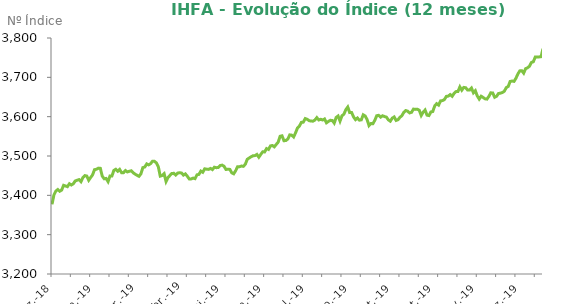
| Category | Número Índice |
|---|---|
| 2018-12-31 | 3377.15 |
| 2019-01-02 | 3401.11 |
| 2019-01-03 | 3410.88 |
| 2019-01-04 | 3414.74 |
| 2019-01-07 | 3410.36 |
| 2019-01-08 | 3413.41 |
| 2019-01-09 | 3425.43 |
| 2019-01-10 | 3423.91 |
| 2019-01-11 | 3422.05 |
| 2019-01-14 | 3429.47 |
| 2019-01-15 | 3426.26 |
| 2019-01-16 | 3429.22 |
| 2019-01-17 | 3436.47 |
| 2019-01-18 | 3438.33 |
| 2019-01-21 | 3439.97 |
| 2019-01-22 | 3434.78 |
| 2019-01-23 | 3445.3 |
| 2019-01-24 | 3450.2 |
| 2019-01-25 | 3449.02 |
| 2019-01-28 | 3438.36 |
| 2019-01-29 | 3445.38 |
| 2019-01-30 | 3452.17 |
| 2019-01-31 | 3465.34 |
| 2019-02-01 | 3466.31 |
| 2019-02-04 | 3469.1 |
| 2019-02-05 | 3468.62 |
| 2019-02-06 | 3448.82 |
| 2019-02-07 | 3442.1 |
| 2019-02-08 | 3442.92 |
| 2019-02-11 | 3434.87 |
| 2019-02-12 | 3449.41 |
| 2019-02-13 | 3449.28 |
| 2019-02-14 | 3463.32 |
| 2019-02-15 | 3466.29 |
| 2019-02-18 | 3461.34 |
| 2019-02-19 | 3465.91 |
| 2019-02-20 | 3457.52 |
| 2019-02-21 | 3457.68 |
| 2019-02-22 | 3463.13 |
| 2019-02-25 | 3459.46 |
| 2019-02-26 | 3461.08 |
| 2019-02-27 | 3462.43 |
| 2019-02-28 | 3457.39 |
| 2019-03-01 | 3453.9 |
| 2019-03-06 | 3450.98 |
| 2019-03-07 | 3448.38 |
| 2019-03-08 | 3454.71 |
| 2019-03-11 | 3470.55 |
| 2019-03-12 | 3472 |
| 2019-03-13 | 3479.8 |
| 2019-03-14 | 3477.46 |
| 2019-03-15 | 3480.44 |
| 2019-03-18 | 3486.81 |
| 2019-03-19 | 3486.47 |
| 2019-03-20 | 3482.55 |
| 2019-03-21 | 3472.66 |
| 2019-03-22 | 3448.91 |
| 2019-03-25 | 3450.49 |
| 2019-03-26 | 3455.04 |
| 2019-03-27 | 3435.26 |
| 2019-03-28 | 3445.23 |
| 2019-03-29 | 3450.55 |
| 2019-04-01 | 3455.53 |
| 2019-04-02 | 3455.96 |
| 2019-04-03 | 3451.66 |
| 2019-04-04 | 3456.6 |
| 2019-04-05 | 3457.46 |
| 2019-04-08 | 3456.75 |
| 2019-04-09 | 3451.45 |
| 2019-04-10 | 3454.53 |
| 2019-04-11 | 3448.57 |
| 2019-04-12 | 3441.68 |
| 2019-04-15 | 3441.78 |
| 2019-04-16 | 3443.8 |
| 2019-04-17 | 3442.35 |
| 2019-04-18 | 3452.15 |
| 2019-04-22 | 3453.19 |
| 2019-04-23 | 3461.68 |
| 2019-04-24 | 3458.64 |
| 2019-04-25 | 3467.48 |
| 2019-04-26 | 3466.45 |
| 2019-04-29 | 3465.96 |
| 2019-04-30 | 3468.43 |
| 2019-05-02 | 3465.48 |
| 2019-05-03 | 3471.48 |
| 2019-05-06 | 3470.29 |
| 2019-05-07 | 3470.76 |
| 2019-05-08 | 3475.74 |
| 2019-05-09 | 3476.77 |
| 2019-05-10 | 3473.98 |
| 2019-05-13 | 3465.77 |
| 2019-05-14 | 3466.3 |
| 2019-05-15 | 3465.94 |
| 2019-05-16 | 3457.25 |
| 2019-05-17 | 3454.72 |
| 2019-05-20 | 3462.51 |
| 2019-05-21 | 3472.72 |
| 2019-05-22 | 3472.85 |
| 2019-05-23 | 3474.52 |
| 2019-05-24 | 3473.72 |
| 2019-05-27 | 3478.96 |
| 2019-05-28 | 3491.5 |
| 2019-05-29 | 3494.91 |
| 2019-05-30 | 3498.04 |
| 2019-05-31 | 3500.7 |
| 2019-06-03 | 3501.03 |
| 2019-06-04 | 3503.99 |
| 2019-06-05 | 3496.92 |
| 2019-06-06 | 3504.11 |
| 2019-06-07 | 3510.63 |
| 2019-06-10 | 3510.43 |
| 2019-06-11 | 3518.93 |
| 2019-06-12 | 3516.54 |
| 2019-06-13 | 3525.65 |
| 2019-06-14 | 3526.71 |
| 2019-06-17 | 3523.26 |
| 2019-06-18 | 3529.37 |
| 2019-06-19 | 3535.22 |
| 2019-06-21 | 3550.18 |
| 2019-06-24 | 3551.32 |
| 2019-06-25 | 3538.83 |
| 2019-06-26 | 3539.32 |
| 2019-06-27 | 3543.3 |
| 2019-06-28 | 3553.65 |
| 2019-07-01 | 3553.04 |
| 2019-07-02 | 3548.42 |
| 2019-07-03 | 3558.97 |
| 2019-07-04 | 3571.32 |
| 2019-07-05 | 3576.12 |
| 2019-07-08 | 3585.51 |
| 2019-07-09 | 3586.05 |
| 2019-07-10 | 3595.15 |
| 2019-07-11 | 3593.46 |
| 2019-07-12 | 3589.89 |
| 2019-07-15 | 3588.83 |
| 2019-07-16 | 3588.57 |
| 2019-07-17 | 3591.38 |
| 2019-07-18 | 3597.59 |
| 2019-07-19 | 3591.67 |
| 2019-07-22 | 3593.35 |
| 2019-07-23 | 3591.51 |
| 2019-07-24 | 3594.15 |
| 2019-07-25 | 3584.45 |
| 2019-07-26 | 3587.89 |
| 2019-07-29 | 3590.73 |
| 2019-07-30 | 3590.33 |
| 2019-07-31 | 3583.69 |
| 2019-08-01 | 3598.05 |
| 2019-08-02 | 3601.69 |
| 2019-08-05 | 3588.68 |
| 2019-08-06 | 3602.24 |
| 2019-08-07 | 3606.34 |
| 2019-08-08 | 3617.72 |
| 2019-08-09 | 3624.53 |
| 2019-08-12 | 3610.34 |
| 2019-08-13 | 3610.55 |
| 2019-08-14 | 3599.38 |
| 2019-08-15 | 3592.43 |
| 2019-08-16 | 3596.68 |
| 2019-08-19 | 3591.12 |
| 2019-08-20 | 3591.86 |
| 2019-08-21 | 3604.7 |
| 2019-08-22 | 3601.78 |
| 2019-08-23 | 3592.65 |
| 2019-08-26 | 3577.37 |
| 2019-08-27 | 3582.55 |
| 2019-08-28 | 3582.03 |
| 2019-08-29 | 3590.8 |
| 2019-08-30 | 3602.48 |
| 2019-09-02 | 3603.44 |
| 2019-09-03 | 3598.71 |
| 2019-09-04 | 3602.27 |
| 2019-09-05 | 3600.4 |
| 2019-09-06 | 3598.84 |
| 2019-09-09 | 3591.95 |
| 2019-09-10 | 3588.45 |
| 2019-09-11 | 3596.16 |
| 2019-09-12 | 3599.3 |
| 2019-09-13 | 3590.4 |
| 2019-09-16 | 3592.25 |
| 2019-09-17 | 3598.49 |
| 2019-09-18 | 3602.45 |
| 2019-09-19 | 3611.08 |
| 2019-09-20 | 3615.5 |
| 2019-09-23 | 3613.9 |
| 2019-09-24 | 3609.54 |
| 2019-09-25 | 3611.04 |
| 2019-09-26 | 3619.26 |
| 2019-09-27 | 3618.54 |
| 2019-09-30 | 3618.96 |
| 2019-10-01 | 3616.23 |
| 2019-10-02 | 3603.03 |
| 2019-10-03 | 3611.38 |
| 2019-10-04 | 3616.82 |
| 2019-10-07 | 3603.91 |
| 2019-10-08 | 3602.73 |
| 2019-10-09 | 3612.01 |
| 2019-10-10 | 3613.11 |
| 2019-10-11 | 3627.63 |
| 2019-10-14 | 3633.03 |
| 2019-10-15 | 3629.38 |
| 2019-10-16 | 3640.11 |
| 2019-10-17 | 3640.99 |
| 2019-10-18 | 3643.51 |
| 2019-10-21 | 3651.6 |
| 2019-10-22 | 3652.29 |
| 2019-10-23 | 3656.21 |
| 2019-10-24 | 3651.83 |
| 2019-10-25 | 3659.19 |
| 2019-10-28 | 3663.71 |
| 2019-10-29 | 3663.96 |
| 2019-10-30 | 3675.68 |
| 2019-10-31 | 3667.34 |
| 2019-11-01 | 3674.35 |
| 2019-11-04 | 3673.68 |
| 2019-11-05 | 3667.65 |
| 2019-11-06 | 3667.55 |
| 2019-11-07 | 3672.79 |
| 2019-11-08 | 3660.78 |
| 2019-11-11 | 3665.99 |
| 2019-11-12 | 3652.71 |
| 2019-11-13 | 3644.75 |
| 2019-11-14 | 3652.05 |
| 2019-11-18 | 3648.86 |
| 2019-11-19 | 3645.43 |
| 2019-11-20 | 3644.63 |
| 2019-11-21 | 3651.61 |
| 2019-11-22 | 3660.67 |
| 2019-11-25 | 3660.18 |
| 2019-11-26 | 3649.27 |
| 2019-11-27 | 3651.84 |
| 2019-11-28 | 3658.99 |
| 2019-11-29 | 3659.76 |
| 2019-12-02 | 3661.46 |
| 2019-12-03 | 3664.72 |
| 2019-12-04 | 3673.86 |
| 2019-12-05 | 3676.85 |
| 2019-12-06 | 3689.44 |
| 2019-12-09 | 3690.6 |
| 2019-12-10 | 3689.62 |
| 2019-12-11 | 3697.7 |
| 2019-12-12 | 3708.46 |
| 2019-12-13 | 3716.44 |
| 2019-12-16 | 3716.93 |
| 2019-12-17 | 3710.61 |
| 2019-12-18 | 3722.08 |
| 2019-12-19 | 3724.28 |
| 2019-12-20 | 3728.21 |
| 2019-12-23 | 3737.85 |
| 2019-12-24 | 3739.65 |
| 2019-12-26 | 3751.62 |
| 2019-12-27 | 3751.81 |
| 2019-12-30 | 3751.93 |
| 2019-12-31 | 3752.54 |
| 2020-01-02 | 3772.81 |